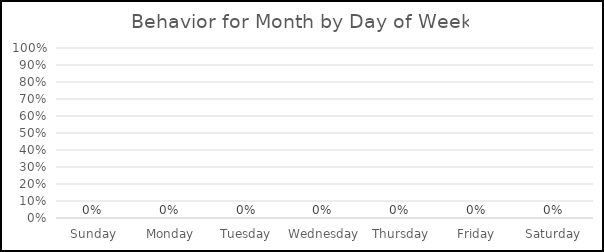
| Category | Behavior for Month by Day of Week |
|---|---|
| Sunday | 0 |
| Monday | 0 |
| Tuesday | 0 |
| Wednesday  | 0 |
| Thursday | 0 |
| Friday | 0 |
| Saturday | 0 |